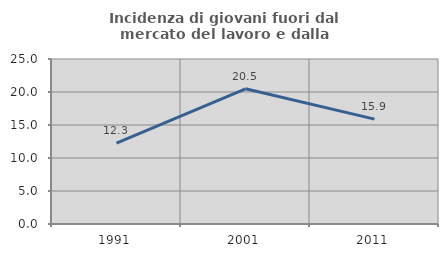
| Category | Incidenza di giovani fuori dal mercato del lavoro e dalla formazione  |
|---|---|
| 1991.0 | 12.258 |
| 2001.0 | 20.482 |
| 2011.0 | 15.892 |